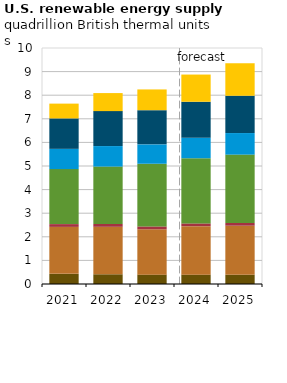
| Category | Other biomass | Wood biomass | Geothermal | Liquid biofuels | Hydropower | Wind power | Solar |
|---|---|---|---|---|---|---|---|
| 2021.0 | 0.43 | 1.989 | 0.118 | 2.331 | 0.858 | 1.289 | 0.627 |
| 2022.0 | 0.412 | 2.012 | 0.118 | 2.433 | 0.869 | 1.481 | 0.765 |
| 2023.0 | 0.397 | 1.923 | 0.12 | 2.656 | 0.821 | 1.45 | 0.877 |
| 2024.0 | 0.396 | 2.054 | 0.117 | 2.762 | 0.869 | 1.525 | 1.152 |
| 2025.0 | 0.391 | 2.079 | 0.114 | 2.899 | 0.913 | 1.581 | 1.381 |